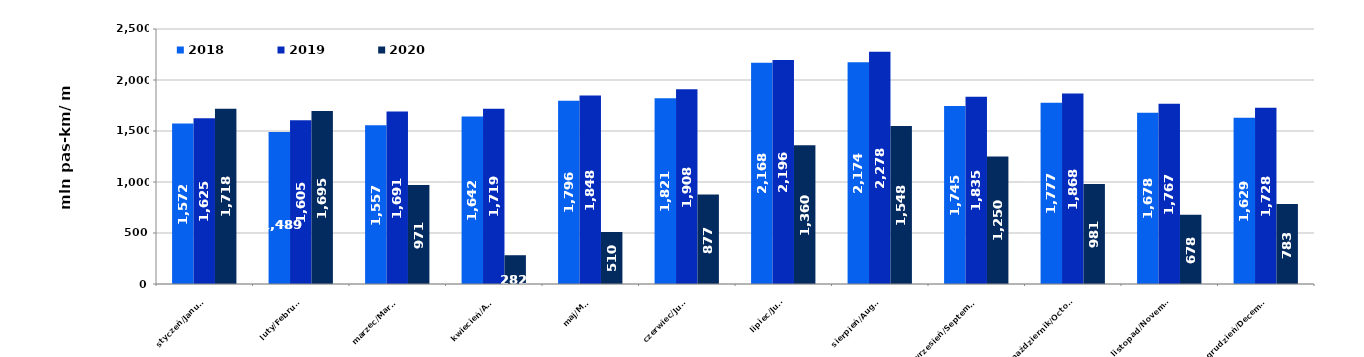
| Category | 2018 | 2019 | 2020 |
|---|---|---|---|
| styczeń/January | 1572.381 | 1624.526 | 1718.2 |
| luty/February | 1489.091 | 1604.654 | 1695.499 |
| marzec/March | 1556.68 | 1690.501 | 970.887 |
| kwiecień/April | 1641.598 | 1718.759 | 282.128 |
| maj/May | 1795.786 | 1847.809 | 510.258 |
| czerwiec/June | 1820.536 | 1908.355 | 876.769 |
| lipiec/July | 2167.927 | 2195.523 | 1360.027 |
| sierpień/August | 2173.885 | 2277.629 | 1548.011 |
| wrzesień/September | 1745.058 | 1834.999 | 1249.993 |
| październik/October | 1777.151 | 1867.597 | 981.263 |
| listopad/November | 1678.054 | 1766.683 | 677.888 |
| grudzień/December | 1629.181 | 1728.165 | 783.386 |